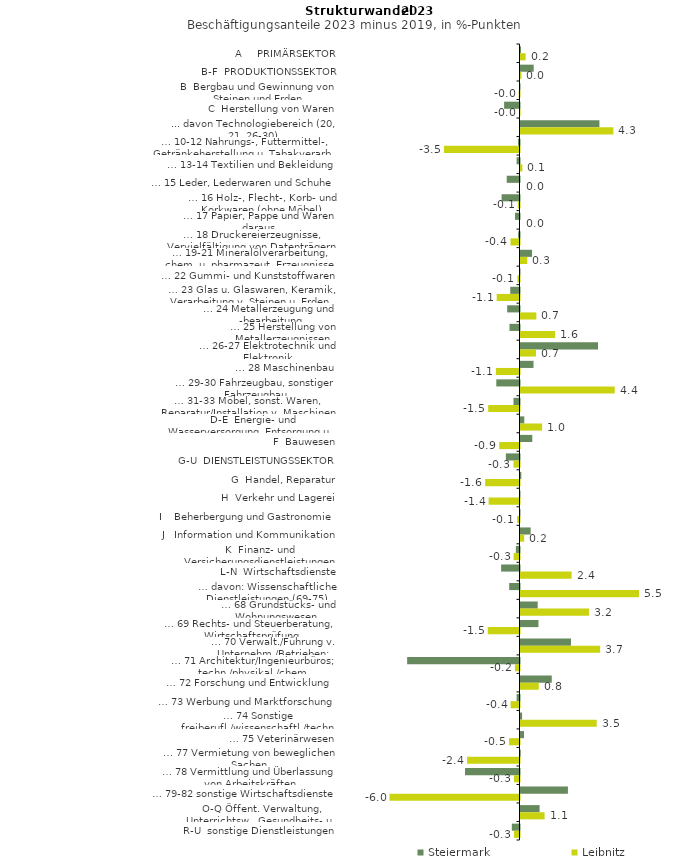
| Category | Steiermark | Leibnitz |
|---|---|---|
| A     PRIMÄRSEKTOR | 0.022 | 0.238 |
| B-F  PRODUKTIONSSEKTOR | 0.612 | 0.043 |
| B  Bergbau und Gewinnung von Steinen und Erden | -0.009 | -0.038 |
| C  Herstellung von Waren | -0.714 | -0.023 |
| ... davon Technologiebereich (20, 21, 26-30) | 3.66 | 4.307 |
| … 10-12 Nahrungs-, Futtermittel-, Getränkeherstellung u. Tabakverarb. | -0.068 | -3.504 |
| … 13-14 Textilien und Bekleidung | -0.134 | 0.088 |
| … 15 Leder, Lederwaren und Schuhe | -0.593 | 0 |
| … 16 Holz-, Flecht-, Korb- und Korkwaren (ohne Möbel)  | -0.83 | -0.076 |
| … 17 Papier, Pappe und Waren daraus  | -0.208 | 0 |
| … 18 Druckereierzeugnisse, Vervielfältigung von Datenträgern | -0.063 | -0.419 |
| … 19-21 Mineralölverarbeitung, chem. u. pharmazeut. Erzeugnisse | 0.535 | 0.314 |
| … 22 Gummi- und Kunststoffwaren | -0.02 | -0.094 |
| … 23 Glas u. Glaswaren, Keramik, Verarbeitung v. Steinen u. Erden  | -0.429 | -1.058 |
| … 24 Metallerzeugung und -bearbeitung | -0.572 | 0.735 |
| … 25 Herstellung von Metallerzeugnissen  | -0.464 | 1.607 |
| … 26-27 Elektrotechnik und Elektronik | 3.595 | 0.716 |
| … 28 Maschinenbau | 0.604 | -1.095 |
| … 29-30 Fahrzeugbau, sonstiger Fahrzeugbau | -1.076 | 4.372 |
| … 31-33 Möbel, sonst. Waren, Reparatur/Installation v. Maschinen | -0.279 | -1.453 |
| D-E  Energie- und Wasserversorgung, Entsorgung u. Rückgewinnung | 0.175 | 1.002 |
| F  Bauwesen | 0.547 | -0.94 |
| G-U  DIENSTLEISTUNGSSEKTOR | -0.633 | -0.281 |
| G  Handel, Reparatur | 0.038 | -1.592 |
| H  Verkehr und Lagerei | -0.011 | -1.433 |
| I    Beherbergung und Gastronomie | -0.007 | -0.108 |
| J   Information und Kommunikation | 0.471 | 0.172 |
| K  Finanz- und Versicherungsdienstleistungen | -0.168 | -0.272 |
| L-N  Wirtschaftsdienste | -0.853 | 2.372 |
| … davon: Wissenschaftliche Dienstleistungen (69-75) | -0.478 | 5.495 |
| … 68 Grundstücks- und Wohnungswesen  | 0.798 | 3.177 |
| … 69 Rechts- und Steuerberatung, Wirtschaftsprüfung | 0.834 | -1.472 |
| … 70 Verwalt./Führung v. Unternehm./Betrieben; Unternehmensberat. | 2.342 | 3.695 |
| … 71 Architektur/Ingenieurbüros; techn./physikal./chem. Untersuchung | -5.212 | -0.211 |
| … 72 Forschung und Entwicklung  | 1.449 | 0.847 |
| … 73 Werbung und Marktforschung | -0.133 | -0.413 |
| … 74 Sonstige freiberufl./wissenschaftl./techn. Tätigkeiten | 0.074 | 3.534 |
| … 75 Veterinärwesen | 0.163 | -0.484 |
| … 77 Vermietung von beweglichen Sachen  | 0.011 | -2.431 |
| … 78 Vermittlung und Überlassung von Arbeitskräften | -2.527 | -0.256 |
| … 79-82 sonstige Wirtschaftsdienste | 2.199 | -6.029 |
| O-Q Öffent. Verwaltung, Unterrichtsw., Gesundheits- u. Sozialwesen | 0.886 | 1.116 |
| R-U  sonstige Dienstleistungen | -0.355 | -0.256 |